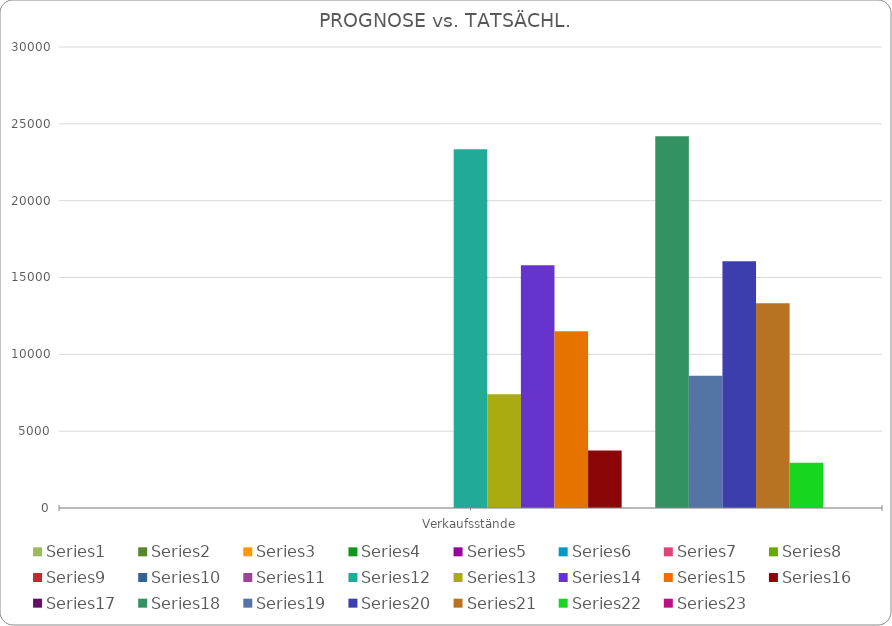
| Category | Series 0 | Series 1 | Series 2 | Series 3 | Series 4 | Series 5 | Series 6 | Series 7 | Series 8 | Series 9 | Series 10 | Series 11 | Series 12 | Series 13 | Series 14 | Series 15 | Series 16 | Series 17 | Series 18 | Series 19 | Series 20 | Series 21 | Series 22 |
|---|---|---|---|---|---|---|---|---|---|---|---|---|---|---|---|---|---|---|---|---|---|---|---|
| Verkaufsstände |  | 0 |  | 0 |  | 0 |  | 0 |  | 0 |  | 23350 | 7400 | 15800 | 11500 | 3750 | 0 | 24200 | 8600 | 16050 | 13325 | 2950 | 0 |